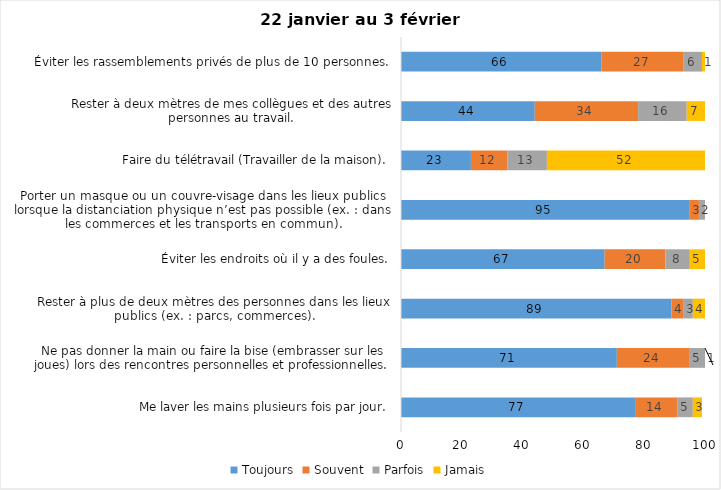
| Category | Toujours | Souvent | Parfois | Jamais |
|---|---|---|---|---|
| Me laver les mains plusieurs fois par jour. | 77 | 14 | 5 | 3 |
| Ne pas donner la main ou faire la bise (embrasser sur les joues) lors des rencontres personnelles et professionnelles. | 71 | 24 | 5 | 1 |
| Rester à plus de deux mètres des personnes dans les lieux publics (ex. : parcs, commerces). | 89 | 4 | 3 | 4 |
| Éviter les endroits où il y a des foules. | 67 | 20 | 8 | 5 |
| Porter un masque ou un couvre-visage dans les lieux publics lorsque la distanciation physique n’est pas possible (ex. : dans les commerces et les transports en commun). | 95 | 3 | 2 | 0 |
| Faire du télétravail (Travailler de la maison). | 23 | 12 | 13 | 52 |
| Rester à deux mètres de mes collègues et des autres personnes au travail. | 44 | 34 | 16 | 7 |
| Éviter les rassemblements privés de plus de 10 personnes. | 66 | 27 | 6 | 1 |